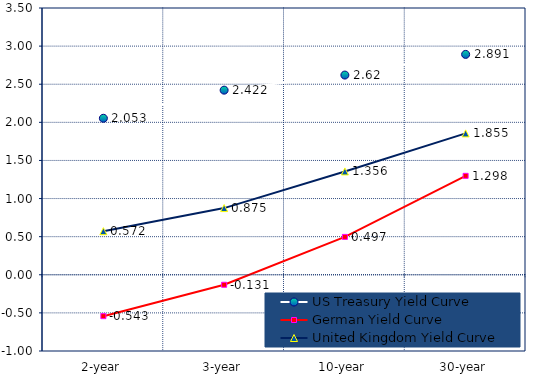
| Category | US Treasury Yield Curve | German Yield Curve | United Kingdom Yield Curve |
|---|---|---|---|
| 2-year | 2.053 | -0.543 | 0.572 |
| 3-year | 2.422 | -0.131 | 0.875 |
| 10-year | 2.62 | 0.497 | 1.356 |
| 30-year | 2.891 | 1.298 | 1.855 |